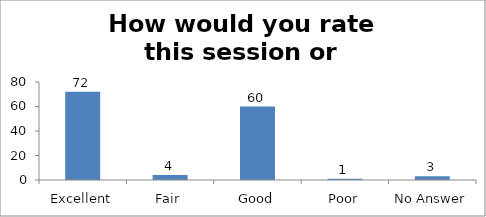
| Category | How would you rate this session or workshop? |
|---|---|
| Excellent | 72 |
| Fair | 4 |
| Good | 60 |
| Poor | 1 |
| No Answer | 3 |